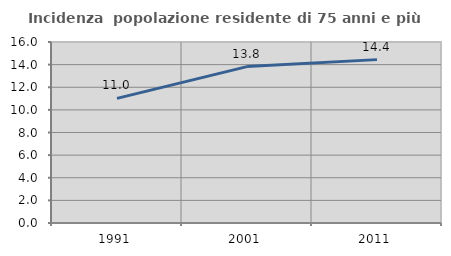
| Category | Incidenza  popolazione residente di 75 anni e più |
|---|---|
| 1991.0 | 11.013 |
| 2001.0 | 13.824 |
| 2011.0 | 14.442 |